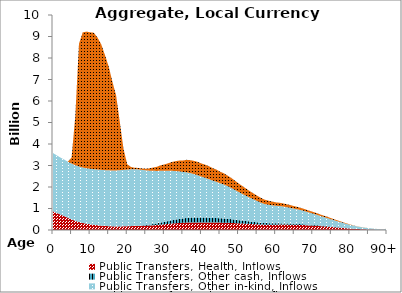
| Category | Public Transfers, Health, Inflows | Public Transfers, Other cash, Inflows | Public Transfers, Other in-kind, Inflows | Public Transfers, Education, Inflows |
|---|---|---|---|---|
| 0 | 870.352 | 0 | 2711.016 | 0 |
|  | 794.555 | 0 | 2676.983 | 0 |
| 2 | 722.034 | 0 | 2648.921 | 0 |
| 3 | 647.832 | 0 | 2626.335 | 0 |
| 4 | 571.907 | 0 | 2608.732 | 0 |
| 5 | 497.587 | 0 | 2595.622 | 272.948 |
| 6 | 427.862 | 0 | 2586.513 | 2265.709 |
| 7 | 372.249 | 0 | 2580.911 | 5707.089 |
| 8 | 328.505 | 0 | 2578.324 | 6283.219 |
| 9 | 293.643 | 0 | 2578.26 | 6355.917 |
| 10 | 267.137 | 0 | 2580.561 | 6348.28 |
| 11 | 243.269 | 0 | 2585.07 | 6347.2 |
| 12 | 222.889 | 0 | 2589.622 | 6138.113 |
| 13 | 204.491 | 0 | 2593.062 | 5839.288 |
| 14 | 189.052 | 0 | 2595.894 | 5353.345 |
| 15 | 176.616 | 0.979 | 2598.583 | 4836.205 |
| 16 | 168.548 | 1.359 | 2599.586 | 4132.338 |
| 17 | 165.481 | 2.642 | 2603.656 | 3495.302 |
| 18 | 165.964 | 2.982 | 2612.738 | 2245.046 |
| 19 | 168.995 | 3.947 | 2623.522 | 975.77 |
| 20 | 173.669 | 4.476 | 2631.725 | 246.192 |
| 21 | 180.524 | 6.754 | 2639.363 | 106.532 |
| 22 | 184.982 | 9.304 | 2635.411 | 63.756 |
| 23 | 189.596 | 14.484 | 2614.314 | 69.317 |
| 24 | 194.295 | 21.008 | 2581.384 | 67.852 |
| 25 | 200.695 | 28.369 | 2547.407 | 75.823 |
| 26 | 208.928 | 40.519 | 2510.13 | 109.228 |
| 27 | 222.07 | 57.324 | 2473.571 | 153.042 |
| 28 | 235.381 | 71.853 | 2440.783 | 191.84 |
| 29 | 253.373 | 93.814 | 2409.598 | 250.993 |
| 30 | 267.285 | 110.848 | 2374.765 | 295.674 |
| 31 | 283.865 | 131.199 | 2337.305 | 349.903 |
| 32 | 300.766 | 153.843 | 2297.91 | 410.244 |
| 33 | 313.747 | 172.212 | 2256.391 | 459.194 |
| 34 | 325.677 | 188.67 | 2212.832 | 503.051 |
| 35 | 333.969 | 199.188 | 2167.884 | 531.079 |
| 36 | 344.846 | 217.67 | 2121.872 | 580.33 |
| 37 | 348.491 | 225.662 | 2072.7 | 601.627 |
| 38 | 350.707 | 230.733 | 2019.535 | 615.141 |
| 39 | 350.02 | 233.425 | 1963.563 | 622.314 |
| 40 | 347.013 | 229.489 | 1906.352 | 611.826 |
| 41 | 346.996 | 230.419 | 1847.051 | 614.303 |
| 42 | 347.187 | 227.22 | 1789.764 | 605.78 |
| 43 | 345.233 | 217.724 | 1736.526 | 580.473 |
| 44 | 346.802 | 213.442 | 1685.235 | 569.063 |
| 45 | 343.277 | 201.715 | 1632.679 | 537.813 |
| 46 | 342.031 | 196.122 | 1580.609 | 522.909 |
| 47 | 335.55 | 184.88 | 1522.551 | 492.952 |
| 48 | 329.193 | 175.064 | 1455.316 | 466.794 |
| 49 | 319.901 | 163.101 | 1382.566 | 434.916 |
| 50 | 309.908 | 148.461 | 1311.978 | 395.903 |
| 51 | 301.547 | 137.567 | 1243.008 | 366.873 |
| 52 | 292.65 | 125.85 | 1175.697 | 335.65 |
| 53 | 283.171 | 114.004 | 1111.163 | 304.082 |
| 54 | 274.102 | 103.302 | 1050.036 | 275.564 |
| 55 | 264.716 | 93.11 | 990.369 | 248.406 |
| 56 | 255.585 | 85.012 | 930.807 | 226.825 |
| 57 | 248.522 | 77.181 | 883.668 | 205.957 |
| 58 | 247.394 | 72.321 | 854.333 | 193.006 |
| 59 | 247.64 | 65.469 | 836.791 | 174.747 |
| 60 | 248.295 | 59.712 | 819.412 | 159.407 |
| 61 | 251.567 | 58.018 | 804.246 | 154.891 |
| 62 | 252.602 | 54.259 | 786.001 | 144.876 |
| 63 | 250.691 | 50.716 | 760.784 | 135.433 |
| 64 | 247.743 | 48.557 | 730.802 | 129.68 |
| 65 | 243.844 | 44.542 | 702.642 | 118.981 |
| 66 | 240.027 | 41.363 | 675.555 | 110.511 |
| 67 | 234.153 | 37.668 | 644.559 | 100.665 |
| 68 | 225.659 | 34.684 | 608.005 | 92.713 |
| 69 | 215.296 | 31.605 | 567.781 | 84.508 |
| 70 | 205.251 | 31.201 | 527.629 | 83.432 |
| 71 | 193.192 | 29.629 | 487.055 | 79.241 |
| 72 | 179.786 | 26.7 | 447.139 | 71.436 |
| 73 | 167.136 | 24.986 | 408.878 | 66.869 |
| 74 | 154.255 | 22.979 | 371.96 | 61.522 |
| 75 | 140.162 | 19.025 | 335.344 | 50.984 |
| 76 | 126.674 | 16.527 | 299.565 | 44.328 |
| 77 | 112.701 | 13.434 | 264.793 | 36.085 |
| 78 | 98.135 | 11.128 | 231.116 | 29.939 |
| 79 | 84.005 | 8.772 | 198.93 | 23.663 |
| 80 | 69.781 | 6.519 | 168.364 | 17.657 |
| 81 | 56.273 | 4.277 | 139.185 | 11.684 |
| 82 | 45.151 | 2.736 | 113.832 | 7.578 |
| 83 | 37.275 | 2.14 | 93.466 | 5.989 |
| 84 | 31.214 | 1.373 | 77.025 | 3.945 |
| 85 | 25.314 | 0.771 | 62.09 | 2.341 |
| 86 | 20.094 | 0.54 | 48.915 | 1.725 |
| 87 | 15.167 | 0.365 | 37.862 | 1.26 |
| 88 | 11.089 | 0.238 | 28.791 | 0.921 |
| 89 | 7.732 | 0.148 | 21.478 | 0.681 |
| 90+ | 16.685 | 0.267 | 48.444 | 0.998 |